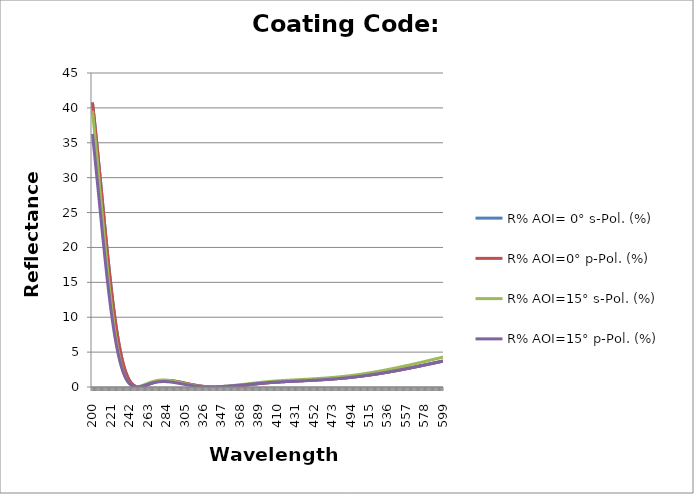
| Category | R% AOI= 0° s-Pol. (%) | R% AOI=0° p-Pol. (%) | R% AOI=15° s-Pol. (%) | R% AOI=15° p-Pol. (%) |
|---|---|---|---|---|
| 200.0 | 40.77 | 40.77 | 39.57 | 36.268 |
| 201.0 | 39.657 | 39.657 | 38.339 | 35.091 |
| 202.0 | 38.51 | 38.51 | 37.076 | 33.887 |
| 203.0 | 37.331 | 37.331 | 35.785 | 32.662 |
| 204.0 | 36.122 | 36.122 | 34.47 | 31.417 |
| 205.0 | 34.886 | 34.886 | 33.133 | 30.158 |
| 206.0 | 33.628 | 33.628 | 31.779 | 28.887 |
| 207.0 | 32.35 | 32.35 | 30.412 | 27.608 |
| 208.0 | 31.056 | 31.056 | 29.036 | 26.326 |
| 209.0 | 29.749 | 29.749 | 27.656 | 25.044 |
| 210.0 | 28.434 | 28.434 | 26.275 | 23.766 |
| 211.0 | 27.117 | 27.117 | 24.902 | 22.5 |
| 212.0 | 25.8 | 25.8 | 23.537 | 21.246 |
| 213.0 | 24.487 | 24.487 | 22.187 | 20.01 |
| 214.0 | 23.182 | 23.182 | 20.854 | 18.794 |
| 215.0 | 21.89 | 21.89 | 19.544 | 17.601 |
| 216.0 | 20.614 | 20.614 | 18.26 | 16.437 |
| 217.0 | 19.358 | 19.358 | 17.006 | 15.303 |
| 218.0 | 18.126 | 18.126 | 15.786 | 14.203 |
| 219.0 | 16.922 | 16.922 | 14.604 | 13.139 |
| 220.0 | 15.749 | 15.749 | 13.463 | 12.114 |
| 221.0 | 14.616 | 14.616 | 12.371 | 11.136 |
| 222.0 | 13.52 | 13.52 | 11.324 | 10.2 |
| 223.0 | 12.464 | 12.464 | 10.325 | 9.308 |
| 224.0 | 11.45 | 11.45 | 9.376 | 8.462 |
| 225.0 | 10.48 | 10.48 | 8.477 | 7.662 |
| 226.0 | 9.556 | 9.556 | 7.629 | 6.907 |
| 227.0 | 8.678 | 8.678 | 6.833 | 6.2 |
| 228.0 | 7.847 | 7.847 | 6.089 | 5.538 |
| 229.0 | 7.065 | 7.065 | 5.396 | 4.922 |
| 230.0 | 6.331 | 6.331 | 4.755 | 4.352 |
| 231.0 | 5.645 | 5.645 | 4.163 | 3.825 |
| 232.0 | 5.007 | 5.007 | 3.62 | 3.342 |
| 233.0 | 4.415 | 4.415 | 3.125 | 2.899 |
| 234.0 | 3.87 | 3.87 | 2.675 | 2.497 |
| 235.0 | 3.37 | 3.37 | 2.27 | 2.134 |
| 236.0 | 2.913 | 2.913 | 1.906 | 1.806 |
| 237.0 | 2.498 | 2.498 | 1.582 | 1.514 |
| 238.0 | 2.123 | 2.123 | 1.296 | 1.255 |
| 239.0 | 1.787 | 1.787 | 1.046 | 1.026 |
| 240.0 | 1.487 | 1.487 | 0.829 | 0.827 |
| 241.0 | 1.222 | 1.222 | 0.642 | 0.654 |
| 242.0 | 0.989 | 0.989 | 0.485 | 0.507 |
| 243.0 | 0.787 | 0.787 | 0.354 | 0.382 |
| 244.0 | 0.613 | 0.613 | 0.248 | 0.279 |
| 245.0 | 0.465 | 0.465 | 0.163 | 0.196 |
| 246.0 | 0.342 | 0.342 | 0.099 | 0.13 |
| 247.0 | 0.241 | 0.241 | 0.053 | 0.08 |
| 248.0 | 0.16 | 0.16 | 0.023 | 0.044 |
| 249.0 | 0.098 | 0.098 | 0.008 | 0.022 |
| 250.0 | 0.053 | 0.053 | 0.005 | 0.01 |
| 251.0 | 0.023 | 0.023 | 0.014 | 0.009 |
| 252.0 | 0.007 | 0.007 | 0.032 | 0.017 |
| 253.0 | 0.002 | 0.002 | 0.057 | 0.031 |
| 254.0 | 0.007 | 0.007 | 0.09 | 0.052 |
| 255.0 | 0.021 | 0.021 | 0.128 | 0.078 |
| 256.0 | 0.043 | 0.043 | 0.171 | 0.109 |
| 257.0 | 0.071 | 0.071 | 0.217 | 0.143 |
| 258.0 | 0.104 | 0.104 | 0.266 | 0.179 |
| 259.0 | 0.143 | 0.143 | 0.317 | 0.218 |
| 260.0 | 0.184 | 0.184 | 0.368 | 0.258 |
| 261.0 | 0.228 | 0.228 | 0.42 | 0.298 |
| 262.0 | 0.274 | 0.274 | 0.472 | 0.339 |
| 263.0 | 0.321 | 0.321 | 0.523 | 0.379 |
| 264.0 | 0.369 | 0.369 | 0.572 | 0.419 |
| 265.0 | 0.417 | 0.417 | 0.62 | 0.457 |
| 266.0 | 0.464 | 0.464 | 0.666 | 0.494 |
| 267.0 | 0.511 | 0.511 | 0.71 | 0.53 |
| 268.0 | 0.556 | 0.556 | 0.751 | 0.563 |
| 269.0 | 0.599 | 0.599 | 0.789 | 0.595 |
| 270.0 | 0.64 | 0.64 | 0.825 | 0.624 |
| 271.0 | 0.68 | 0.68 | 0.857 | 0.651 |
| 272.0 | 0.716 | 0.716 | 0.886 | 0.675 |
| 273.0 | 0.751 | 0.751 | 0.912 | 0.697 |
| 274.0 | 0.782 | 0.782 | 0.934 | 0.716 |
| 275.0 | 0.811 | 0.811 | 0.954 | 0.733 |
| 276.0 | 0.837 | 0.837 | 0.97 | 0.747 |
| 277.0 | 0.859 | 0.859 | 0.982 | 0.758 |
| 278.0 | 0.879 | 0.879 | 0.992 | 0.767 |
| 279.0 | 0.896 | 0.896 | 0.998 | 0.773 |
| 280.0 | 0.91 | 0.91 | 1.002 | 0.777 |
| 281.0 | 0.921 | 0.921 | 1.002 | 0.779 |
| 282.0 | 0.929 | 0.929 | 1 | 0.778 |
| 283.0 | 0.935 | 0.935 | 0.995 | 0.775 |
| 284.0 | 0.937 | 0.937 | 0.987 | 0.77 |
| 285.0 | 0.937 | 0.937 | 0.977 | 0.762 |
| 286.0 | 0.935 | 0.935 | 0.965 | 0.753 |
| 287.0 | 0.93 | 0.93 | 0.95 | 0.742 |
| 288.0 | 0.922 | 0.922 | 0.933 | 0.73 |
| 289.0 | 0.913 | 0.913 | 0.915 | 0.716 |
| 290.0 | 0.901 | 0.901 | 0.894 | 0.7 |
| 291.0 | 0.888 | 0.888 | 0.873 | 0.684 |
| 292.0 | 0.872 | 0.872 | 0.849 | 0.666 |
| 293.0 | 0.855 | 0.855 | 0.825 | 0.646 |
| 294.0 | 0.837 | 0.837 | 0.799 | 0.626 |
| 295.0 | 0.816 | 0.816 | 0.772 | 0.606 |
| 296.0 | 0.795 | 0.795 | 0.744 | 0.584 |
| 297.0 | 0.773 | 0.773 | 0.716 | 0.562 |
| 298.0 | 0.749 | 0.749 | 0.687 | 0.539 |
| 299.0 | 0.725 | 0.725 | 0.658 | 0.516 |
| 300.0 | 0.699 | 0.699 | 0.628 | 0.493 |
| 301.0 | 0.674 | 0.674 | 0.598 | 0.469 |
| 302.0 | 0.648 | 0.648 | 0.569 | 0.446 |
| 303.0 | 0.621 | 0.621 | 0.539 | 0.423 |
| 304.0 | 0.594 | 0.594 | 0.51 | 0.4 |
| 305.0 | 0.567 | 0.567 | 0.48 | 0.376 |
| 306.0 | 0.54 | 0.54 | 0.452 | 0.354 |
| 307.0 | 0.513 | 0.513 | 0.423 | 0.331 |
| 308.0 | 0.486 | 0.486 | 0.395 | 0.309 |
| 309.0 | 0.459 | 0.459 | 0.368 | 0.288 |
| 310.0 | 0.433 | 0.433 | 0.341 | 0.266 |
| 311.0 | 0.407 | 0.407 | 0.315 | 0.246 |
| 312.0 | 0.381 | 0.381 | 0.29 | 0.226 |
| 313.0 | 0.356 | 0.356 | 0.265 | 0.207 |
| 314.0 | 0.331 | 0.331 | 0.242 | 0.188 |
| 315.0 | 0.307 | 0.307 | 0.219 | 0.171 |
| 316.0 | 0.283 | 0.283 | 0.198 | 0.154 |
| 317.0 | 0.261 | 0.261 | 0.177 | 0.138 |
| 318.0 | 0.239 | 0.239 | 0.158 | 0.122 |
| 319.0 | 0.218 | 0.218 | 0.139 | 0.108 |
| 320.0 | 0.197 | 0.197 | 0.122 | 0.094 |
| 321.0 | 0.178 | 0.178 | 0.106 | 0.082 |
| 322.0 | 0.16 | 0.16 | 0.091 | 0.07 |
| 323.0 | 0.143 | 0.143 | 0.077 | 0.059 |
| 324.0 | 0.126 | 0.126 | 0.065 | 0.05 |
| 325.0 | 0.111 | 0.111 | 0.053 | 0.041 |
| 326.0 | 0.096 | 0.096 | 0.043 | 0.033 |
| 327.0 | 0.083 | 0.083 | 0.034 | 0.026 |
| 328.0 | 0.07 | 0.07 | 0.026 | 0.02 |
| 329.0 | 0.059 | 0.059 | 0.019 | 0.015 |
| 330.0 | 0.049 | 0.049 | 0.014 | 0.01 |
| 331.0 | 0.039 | 0.039 | 0.009 | 0.007 |
| 332.0 | 0.031 | 0.031 | 0.005 | 0.004 |
| 333.0 | 0.024 | 0.024 | 0.003 | 0.003 |
| 334.0 | 0.017 | 0.017 | 0.002 | 0.002 |
| 335.0 | 0.012 | 0.012 | 0.002 | 0.002 |
| 336.0 | 0.008 | 0.008 | 0.002 | 0.003 |
| 337.0 | 0.004 | 0.004 | 0.004 | 0.005 |
| 338.0 | 0.002 | 0.002 | 0.007 | 0.007 |
| 339.0 | 0 | 0 | 0.011 | 0.01 |
| 340.0 | 0 | 0 | 0.015 | 0.014 |
| 341.0 | 0 | 0 | 0.021 | 0.019 |
| 342.0 | 0.002 | 0.002 | 0.027 | 0.024 |
| 343.0 | 0.004 | 0.004 | 0.035 | 0.03 |
| 344.0 | 0.007 | 0.007 | 0.043 | 0.037 |
| 345.0 | 0.01 | 0.01 | 0.051 | 0.044 |
| 346.0 | 0.015 | 0.015 | 0.061 | 0.052 |
| 347.0 | 0.02 | 0.02 | 0.071 | 0.06 |
| 348.0 | 0.026 | 0.026 | 0.082 | 0.069 |
| 349.0 | 0.033 | 0.033 | 0.094 | 0.079 |
| 350.0 | 0.04 | 0.04 | 0.106 | 0.089 |
| 351.0 | 0.047 | 0.047 | 0.116 | 0.097 |
| 352.0 | 0.054 | 0.054 | 0.127 | 0.106 |
| 353.0 | 0.061 | 0.061 | 0.138 | 0.115 |
| 354.0 | 0.069 | 0.069 | 0.15 | 0.124 |
| 355.0 | 0.077 | 0.077 | 0.161 | 0.133 |
| 356.0 | 0.085 | 0.085 | 0.172 | 0.142 |
| 357.0 | 0.094 | 0.094 | 0.184 | 0.151 |
| 358.0 | 0.103 | 0.103 | 0.196 | 0.161 |
| 359.0 | 0.112 | 0.112 | 0.208 | 0.17 |
| 360.0 | 0.121 | 0.121 | 0.22 | 0.18 |
| 361.0 | 0.13 | 0.13 | 0.232 | 0.19 |
| 362.0 | 0.139 | 0.139 | 0.244 | 0.199 |
| 363.0 | 0.149 | 0.149 | 0.256 | 0.209 |
| 364.0 | 0.158 | 0.158 | 0.268 | 0.218 |
| 365.0 | 0.168 | 0.168 | 0.28 | 0.228 |
| 366.0 | 0.178 | 0.178 | 0.292 | 0.238 |
| 367.0 | 0.188 | 0.188 | 0.304 | 0.248 |
| 368.0 | 0.197 | 0.197 | 0.316 | 0.258 |
| 369.0 | 0.207 | 0.207 | 0.328 | 0.267 |
| 370.0 | 0.217 | 0.217 | 0.34 | 0.277 |
| 371.0 | 0.227 | 0.227 | 0.352 | 0.287 |
| 372.0 | 0.24 | 0.24 | 0.367 | 0.299 |
| 373.0 | 0.254 | 0.254 | 0.383 | 0.312 |
| 374.0 | 0.267 | 0.267 | 0.399 | 0.325 |
| 375.0 | 0.281 | 0.281 | 0.415 | 0.338 |
| 376.0 | 0.295 | 0.295 | 0.431 | 0.351 |
| 377.0 | 0.308 | 0.308 | 0.447 | 0.364 |
| 378.0 | 0.322 | 0.322 | 0.463 | 0.376 |
| 379.0 | 0.336 | 0.336 | 0.479 | 0.389 |
| 380.0 | 0.35 | 0.35 | 0.494 | 0.402 |
| 381.0 | 0.363 | 0.363 | 0.51 | 0.414 |
| 382.0 | 0.377 | 0.377 | 0.525 | 0.426 |
| 383.0 | 0.391 | 0.391 | 0.54 | 0.439 |
| 384.0 | 0.404 | 0.404 | 0.555 | 0.451 |
| 385.0 | 0.418 | 0.418 | 0.57 | 0.463 |
| 386.0 | 0.431 | 0.431 | 0.585 | 0.475 |
| 387.0 | 0.444 | 0.444 | 0.6 | 0.486 |
| 388.0 | 0.458 | 0.458 | 0.614 | 0.498 |
| 389.0 | 0.471 | 0.471 | 0.628 | 0.509 |
| 390.0 | 0.484 | 0.484 | 0.642 | 0.52 |
| 391.0 | 0.496 | 0.496 | 0.656 | 0.532 |
| 392.0 | 0.509 | 0.509 | 0.67 | 0.542 |
| 393.0 | 0.522 | 0.522 | 0.683 | 0.553 |
| 394.0 | 0.534 | 0.534 | 0.696 | 0.564 |
| 395.0 | 0.546 | 0.546 | 0.709 | 0.574 |
| 396.0 | 0.558 | 0.558 | 0.722 | 0.584 |
| 397.0 | 0.57 | 0.57 | 0.734 | 0.594 |
| 398.0 | 0.582 | 0.582 | 0.746 | 0.604 |
| 399.0 | 0.593 | 0.593 | 0.758 | 0.613 |
| 400.0 | 0.604 | 0.604 | 0.77 | 0.623 |
| 401.0 | 0.615 | 0.615 | 0.781 | 0.632 |
| 402.0 | 0.626 | 0.626 | 0.793 | 0.641 |
| 403.0 | 0.637 | 0.637 | 0.804 | 0.649 |
| 404.0 | 0.647 | 0.647 | 0.814 | 0.658 |
| 405.0 | 0.657 | 0.657 | 0.825 | 0.666 |
| 406.0 | 0.667 | 0.667 | 0.835 | 0.674 |
| 407.0 | 0.677 | 0.677 | 0.845 | 0.682 |
| 408.0 | 0.685 | 0.685 | 0.854 | 0.69 |
| 409.0 | 0.694 | 0.694 | 0.862 | 0.697 |
| 410.0 | 0.702 | 0.702 | 0.871 | 0.704 |
| 411.0 | 0.711 | 0.711 | 0.879 | 0.71 |
| 412.0 | 0.719 | 0.719 | 0.887 | 0.717 |
| 413.0 | 0.727 | 0.727 | 0.896 | 0.724 |
| 414.0 | 0.735 | 0.735 | 0.904 | 0.73 |
| 415.0 | 0.742 | 0.742 | 0.911 | 0.736 |
| 416.0 | 0.75 | 0.75 | 0.919 | 0.743 |
| 417.0 | 0.757 | 0.757 | 0.927 | 0.749 |
| 418.0 | 0.765 | 0.765 | 0.934 | 0.755 |
| 419.0 | 0.772 | 0.772 | 0.941 | 0.761 |
| 420.0 | 0.779 | 0.779 | 0.949 | 0.767 |
| 421.0 | 0.786 | 0.786 | 0.956 | 0.773 |
| 422.0 | 0.793 | 0.793 | 0.963 | 0.779 |
| 423.0 | 0.8 | 0.8 | 0.97 | 0.785 |
| 424.0 | 0.807 | 0.807 | 0.977 | 0.79 |
| 425.0 | 0.813 | 0.813 | 0.984 | 0.796 |
| 426.0 | 0.82 | 0.82 | 0.991 | 0.802 |
| 427.0 | 0.827 | 0.827 | 0.998 | 0.808 |
| 428.0 | 0.833 | 0.833 | 1.004 | 0.813 |
| 429.0 | 0.84 | 0.84 | 1.011 | 0.819 |
| 430.0 | 0.846 | 0.846 | 1.018 | 0.825 |
| 431.0 | 0.852 | 0.852 | 1.025 | 0.83 |
| 432.0 | 0.859 | 0.859 | 1.031 | 0.836 |
| 433.0 | 0.865 | 0.865 | 1.038 | 0.842 |
| 434.0 | 0.871 | 0.871 | 1.045 | 0.848 |
| 435.0 | 0.878 | 0.878 | 1.052 | 0.854 |
| 436.0 | 0.884 | 0.884 | 1.058 | 0.86 |
| 437.0 | 0.89 | 0.89 | 1.065 | 0.866 |
| 438.0 | 0.897 | 0.897 | 1.072 | 0.872 |
| 439.0 | 0.903 | 0.903 | 1.079 | 0.878 |
| 440.0 | 0.91 | 0.91 | 1.086 | 0.884 |
| 441.0 | 0.916 | 0.916 | 1.093 | 0.89 |
| 442.0 | 0.922 | 0.922 | 1.101 | 0.897 |
| 443.0 | 0.929 | 0.929 | 1.108 | 0.904 |
| 444.0 | 0.936 | 0.936 | 1.115 | 0.91 |
| 445.0 | 0.942 | 0.942 | 1.122 | 0.916 |
| 446.0 | 0.948 | 0.948 | 1.129 | 0.922 |
| 447.0 | 0.955 | 0.955 | 1.136 | 0.929 |
| 448.0 | 0.961 | 0.961 | 1.144 | 0.935 |
| 449.0 | 0.967 | 0.967 | 1.151 | 0.941 |
| 450.0 | 0.974 | 0.974 | 1.158 | 0.948 |
| 451.0 | 0.98 | 0.98 | 1.165 | 0.954 |
| 452.0 | 0.987 | 0.987 | 1.173 | 0.961 |
| 453.0 | 0.994 | 0.994 | 1.18 | 0.968 |
| 454.0 | 1 | 1 | 1.188 | 0.975 |
| 455.0 | 1.007 | 1.007 | 1.196 | 0.982 |
| 456.0 | 1.014 | 1.014 | 1.204 | 0.989 |
| 457.0 | 1.021 | 1.021 | 1.212 | 0.996 |
| 458.0 | 1.028 | 1.028 | 1.22 | 1.003 |
| 459.0 | 1.035 | 1.035 | 1.228 | 1.011 |
| 460.0 | 1.042 | 1.042 | 1.237 | 1.018 |
| 461.0 | 1.05 | 1.05 | 1.245 | 1.026 |
| 462.0 | 1.057 | 1.057 | 1.254 | 1.034 |
| 463.0 | 1.065 | 1.065 | 1.263 | 1.042 |
| 464.0 | 1.072 | 1.072 | 1.272 | 1.05 |
| 465.0 | 1.08 | 1.08 | 1.281 | 1.058 |
| 466.0 | 1.088 | 1.088 | 1.291 | 1.067 |
| 467.0 | 1.096 | 1.096 | 1.3 | 1.076 |
| 468.0 | 1.104 | 1.104 | 1.31 | 1.084 |
| 469.0 | 1.113 | 1.113 | 1.32 | 1.093 |
| 470.0 | 1.121 | 1.121 | 1.33 | 1.102 |
| 471.0 | 1.13 | 1.13 | 1.34 | 1.112 |
| 472.0 | 1.139 | 1.139 | 1.351 | 1.121 |
| 473.0 | 1.148 | 1.148 | 1.361 | 1.13 |
| 474.0 | 1.157 | 1.157 | 1.372 | 1.14 |
| 475.0 | 1.166 | 1.166 | 1.383 | 1.15 |
| 476.0 | 1.176 | 1.176 | 1.394 | 1.16 |
| 477.0 | 1.185 | 1.185 | 1.406 | 1.17 |
| 478.0 | 1.195 | 1.195 | 1.417 | 1.181 |
| 479.0 | 1.205 | 1.205 | 1.429 | 1.192 |
| 480.0 | 1.215 | 1.215 | 1.441 | 1.202 |
| 481.0 | 1.225 | 1.225 | 1.454 | 1.213 |
| 482.0 | 1.236 | 1.236 | 1.466 | 1.225 |
| 483.0 | 1.246 | 1.246 | 1.479 | 1.236 |
| 484.0 | 1.257 | 1.257 | 1.492 | 1.248 |
| 485.0 | 1.268 | 1.268 | 1.505 | 1.259 |
| 486.0 | 1.28 | 1.28 | 1.518 | 1.271 |
| 487.0 | 1.291 | 1.291 | 1.532 | 1.284 |
| 488.0 | 1.303 | 1.303 | 1.546 | 1.296 |
| 489.0 | 1.314 | 1.314 | 1.56 | 1.308 |
| 490.0 | 1.326 | 1.326 | 1.574 | 1.321 |
| 491.0 | 1.339 | 1.339 | 1.588 | 1.334 |
| 492.0 | 1.351 | 1.351 | 1.603 | 1.347 |
| 493.0 | 1.364 | 1.364 | 1.618 | 1.361 |
| 494.0 | 1.376 | 1.376 | 1.633 | 1.374 |
| 495.0 | 1.39 | 1.39 | 1.649 | 1.388 |
| 496.0 | 1.404 | 1.404 | 1.666 | 1.403 |
| 497.0 | 1.418 | 1.418 | 1.682 | 1.418 |
| 498.0 | 1.433 | 1.433 | 1.699 | 1.433 |
| 499.0 | 1.447 | 1.447 | 1.717 | 1.449 |
| 500.0 | 1.462 | 1.462 | 1.734 | 1.464 |
| 501.0 | 1.478 | 1.478 | 1.752 | 1.48 |
| 502.0 | 1.493 | 1.493 | 1.77 | 1.496 |
| 503.0 | 1.508 | 1.508 | 1.788 | 1.512 |
| 504.0 | 1.523 | 1.523 | 1.806 | 1.527 |
| 505.0 | 1.538 | 1.538 | 1.824 | 1.543 |
| 506.0 | 1.554 | 1.554 | 1.842 | 1.56 |
| 507.0 | 1.57 | 1.57 | 1.86 | 1.576 |
| 508.0 | 1.586 | 1.586 | 1.879 | 1.592 |
| 509.0 | 1.602 | 1.602 | 1.898 | 1.609 |
| 510.0 | 1.619 | 1.619 | 1.917 | 1.626 |
| 511.0 | 1.635 | 1.635 | 1.937 | 1.643 |
| 512.0 | 1.652 | 1.652 | 1.956 | 1.66 |
| 513.0 | 1.669 | 1.669 | 1.976 | 1.678 |
| 514.0 | 1.686 | 1.686 | 1.996 | 1.696 |
| 515.0 | 1.704 | 1.704 | 2.016 | 1.713 |
| 516.0 | 1.721 | 1.721 | 2.037 | 1.731 |
| 517.0 | 1.739 | 1.739 | 2.057 | 1.749 |
| 518.0 | 1.757 | 1.757 | 2.078 | 1.768 |
| 519.0 | 1.775 | 1.775 | 2.099 | 1.786 |
| 520.0 | 1.794 | 1.794 | 2.12 | 1.805 |
| 521.0 | 1.812 | 1.812 | 2.142 | 1.824 |
| 522.0 | 1.831 | 1.831 | 2.163 | 1.843 |
| 523.0 | 1.85 | 1.85 | 2.185 | 1.862 |
| 524.0 | 1.869 | 1.869 | 2.207 | 1.881 |
| 525.0 | 1.888 | 1.888 | 2.229 | 1.9 |
| 526.0 | 1.908 | 1.908 | 2.252 | 1.92 |
| 527.0 | 1.927 | 1.927 | 2.274 | 1.94 |
| 528.0 | 1.947 | 1.947 | 2.297 | 1.96 |
| 529.0 | 1.967 | 1.967 | 2.32 | 1.98 |
| 530.0 | 1.987 | 1.987 | 2.343 | 2 |
| 531.0 | 2.007 | 2.007 | 2.366 | 2.02 |
| 532.0 | 2.028 | 2.028 | 2.389 | 2.041 |
| 533.0 | 2.049 | 2.049 | 2.414 | 2.062 |
| 534.0 | 2.07 | 2.07 | 2.438 | 2.083 |
| 535.0 | 2.091 | 2.091 | 2.462 | 2.105 |
| 536.0 | 2.113 | 2.113 | 2.487 | 2.126 |
| 537.0 | 2.135 | 2.135 | 2.512 | 2.148 |
| 538.0 | 2.157 | 2.157 | 2.536 | 2.17 |
| 539.0 | 2.179 | 2.179 | 2.562 | 2.192 |
| 540.0 | 2.201 | 2.201 | 2.587 | 2.214 |
| 541.0 | 2.223 | 2.223 | 2.612 | 2.237 |
| 542.0 | 2.246 | 2.246 | 2.638 | 2.259 |
| 543.0 | 2.268 | 2.268 | 2.663 | 2.282 |
| 544.0 | 2.291 | 2.291 | 2.689 | 2.304 |
| 545.0 | 2.314 | 2.314 | 2.715 | 2.327 |
| 546.0 | 2.338 | 2.338 | 2.742 | 2.35 |
| 547.0 | 2.361 | 2.361 | 2.768 | 2.374 |
| 548.0 | 2.384 | 2.384 | 2.794 | 2.397 |
| 549.0 | 2.408 | 2.408 | 2.821 | 2.42 |
| 550.0 | 2.432 | 2.432 | 2.848 | 2.444 |
| 551.0 | 2.456 | 2.456 | 2.875 | 2.467 |
| 552.0 | 2.48 | 2.48 | 2.902 | 2.491 |
| 553.0 | 2.504 | 2.504 | 2.929 | 2.515 |
| 554.0 | 2.529 | 2.529 | 2.957 | 2.539 |
| 555.0 | 2.553 | 2.553 | 2.984 | 2.563 |
| 556.0 | 2.577 | 2.577 | 3.012 | 2.587 |
| 557.0 | 2.602 | 2.602 | 3.039 | 2.611 |
| 558.0 | 2.626 | 2.626 | 3.067 | 2.636 |
| 559.0 | 2.651 | 2.651 | 3.094 | 2.66 |
| 560.0 | 2.676 | 2.676 | 3.122 | 2.684 |
| 561.0 | 2.701 | 2.701 | 3.15 | 2.709 |
| 562.0 | 2.726 | 2.726 | 3.178 | 2.733 |
| 563.0 | 2.751 | 2.751 | 3.206 | 2.758 |
| 564.0 | 2.777 | 2.777 | 3.235 | 2.783 |
| 565.0 | 2.802 | 2.802 | 3.263 | 2.808 |
| 566.0 | 2.828 | 2.828 | 3.292 | 2.833 |
| 567.0 | 2.853 | 2.853 | 3.32 | 2.858 |
| 568.0 | 2.879 | 2.879 | 3.349 | 2.883 |
| 569.0 | 2.905 | 2.905 | 3.378 | 2.908 |
| 570.0 | 2.931 | 2.931 | 3.406 | 2.933 |
| 571.0 | 2.957 | 2.957 | 3.435 | 2.958 |
| 572.0 | 2.983 | 2.983 | 3.464 | 2.984 |
| 573.0 | 3.009 | 3.009 | 3.493 | 3.009 |
| 574.0 | 3.035 | 3.035 | 3.523 | 3.035 |
| 575.0 | 3.062 | 3.062 | 3.552 | 3.06 |
| 576.0 | 3.088 | 3.088 | 3.581 | 3.086 |
| 577.0 | 3.115 | 3.115 | 3.61 | 3.112 |
| 578.0 | 3.141 | 3.141 | 3.64 | 3.138 |
| 579.0 | 3.168 | 3.168 | 3.669 | 3.163 |
| 580.0 | 3.195 | 3.195 | 3.699 | 3.189 |
| 581.0 | 3.222 | 3.222 | 3.729 | 3.215 |
| 582.0 | 3.248 | 3.248 | 3.758 | 3.241 |
| 583.0 | 3.275 | 3.275 | 3.788 | 3.267 |
| 584.0 | 3.302 | 3.302 | 3.818 | 3.293 |
| 585.0 | 3.33 | 3.33 | 3.848 | 3.319 |
| 586.0 | 3.357 | 3.357 | 3.878 | 3.345 |
| 587.0 | 3.384 | 3.384 | 3.908 | 3.372 |
| 588.0 | 3.411 | 3.411 | 3.938 | 3.398 |
| 589.0 | 3.438 | 3.438 | 3.968 | 3.424 |
| 590.0 | 3.466 | 3.466 | 3.998 | 3.45 |
| 591.0 | 3.493 | 3.493 | 4.028 | 3.477 |
| 592.0 | 3.52 | 3.52 | 4.058 | 3.503 |
| 593.0 | 3.548 | 3.548 | 4.088 | 3.529 |
| 594.0 | 3.576 | 3.576 | 4.118 | 3.556 |
| 595.0 | 3.603 | 3.603 | 4.148 | 3.582 |
| 596.0 | 3.631 | 3.631 | 4.179 | 3.609 |
| 597.0 | 3.658 | 3.658 | 4.209 | 3.635 |
| 598.0 | 3.686 | 3.686 | 4.239 | 3.662 |
| 599.0 | 3.714 | 3.714 | 4.27 | 3.688 |
| 600.0 | 3.742 | 3.742 | 4.3 | 3.715 |